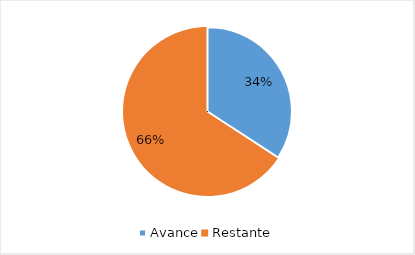
| Category | Series 0 |
|---|---|
| Avance | 0.342 |
| Restante | 0.658 |